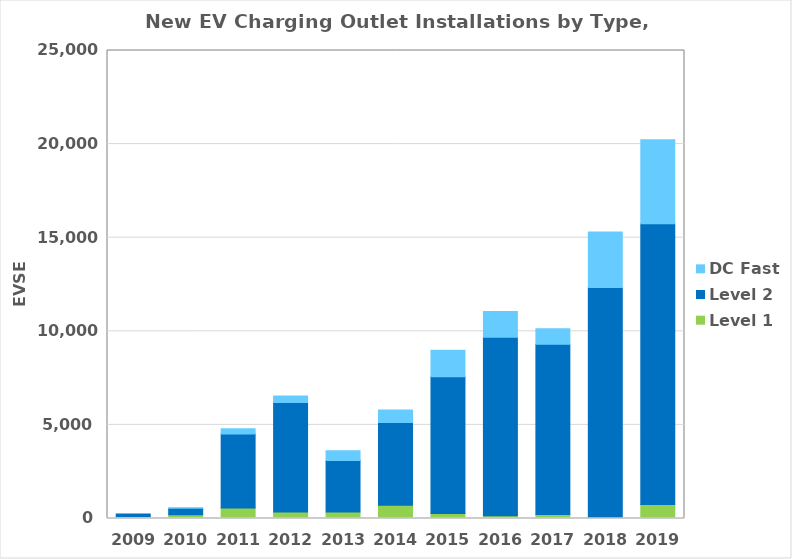
| Category | Level 1 | Level 2 | DC Fast |
|---|---|---|---|
| 2009.0 | 104 | 141 | 0 |
| 2010.0 | 196 | 355 | 11 |
| 2011.0 | 565 | 3949 | 287 |
| 2012.0 | 352 | 5843 | 353 |
| 2013.0 | 352 | 2743 | 528 |
| 2014.0 | 713 | 4421 | 658 |
| 2015.0 | 273 | 7305 | 1416 |
| 2016.0 | 146 | 9540 | 1368 |
| 2017.0 | 218 | 9090 | 823 |
| 2018.0 | 82 | 12257 | 2972 |
| 2019.0 | 749 | 15001 | 4482 |